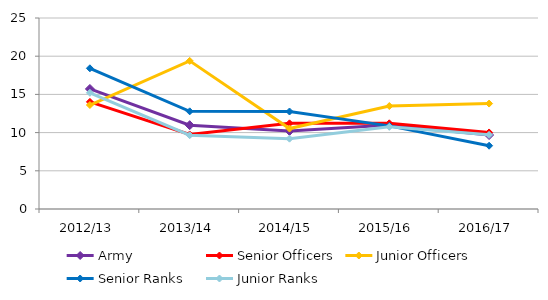
| Category | Army | Senior Officers | Junior Officers | Senior Ranks | Junior Ranks |
|---|---|---|---|---|---|
| 2012/13 | 15.714 | 14.023 | 13.611 | 18.416 | 15.211 |
| 2013/14 | 10.971 | 9.754 | 19.387 | 12.783 | 9.653 |
| 2014/15 | 10.214 | 11.213 | 10.533 | 12.76 | 9.205 |
| 2015/16 | 11.005 | 11.216 | 13.476 | 10.882 | 10.752 |
| 2016/17 | 9.682 | 10.019 | 13.8 | 8.285 | 9.703 |